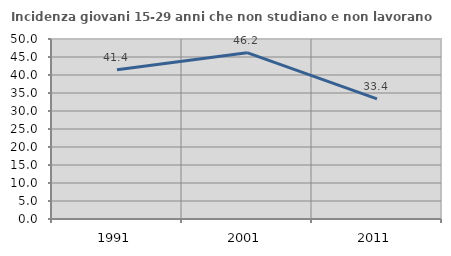
| Category | Incidenza giovani 15-29 anni che non studiano e non lavorano  |
|---|---|
| 1991.0 | 41.429 |
| 2001.0 | 46.203 |
| 2011.0 | 33.378 |